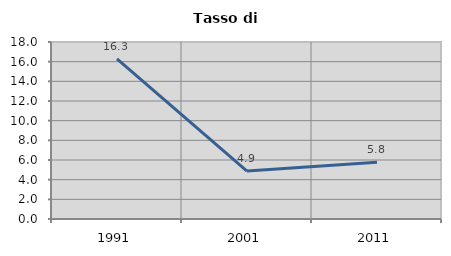
| Category | Tasso di disoccupazione   |
|---|---|
| 1991.0 | 16.279 |
| 2001.0 | 4.878 |
| 2011.0 | 5.769 |